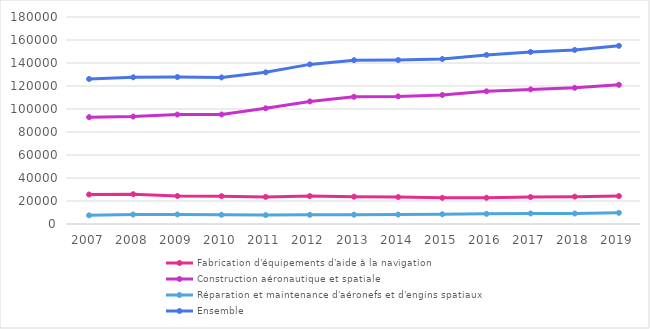
| Category | Fabrication d'équipements d'aide à la navigation | Construction aéronautique et spatiale  | Réparation et maintenance d'aéronefs et d'engins spatiaux  | Ensemble |
|---|---|---|---|---|
| 2007.0 | 25650 | 92866 | 7554 | 126070 |
| 2008.0 | 25904 | 93432 | 8258 | 127594 |
| 2009.0 | 24341 | 95166 | 8290 | 127797 |
| 2010.0 | 24194 | 95218 | 8032 | 127444 |
| 2011.0 | 23578 | 100592 | 7733 | 131903 |
| 2012.0 | 24280 | 106563 | 7952 | 138795 |
| 2013.0 | 23752 | 110611 | 8102 | 142465 |
| 2014.0 | 23427 | 110945 | 8210 | 142582 |
| 2015.0 | 22771 | 112242 | 8465 | 143478 |
| 2016.0 | 22829 | 115364 | 8820 | 147013 |
| 2017.0 | 23414 | 117040 | 9159 | 149613 |
| 2018.0 | 23788 | 118436 | 9121 | 151345 |
| 2019.0 | 24274 | 121005 | 9680 | 154959 |